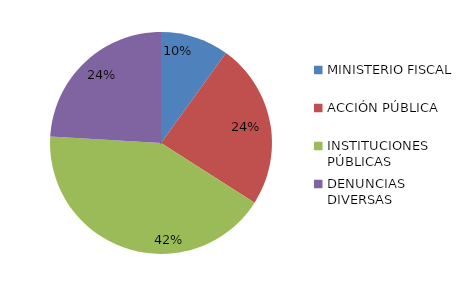
| Category | Series 0 |
|---|---|
| MINISTERIO FISCAL | 19 |
| ACCIÓN PÚBLICA | 46 |
| INSTITUCIONES PÚBLICAS | 80 |
| DENUNCIAS DIVERSAS | 46 |